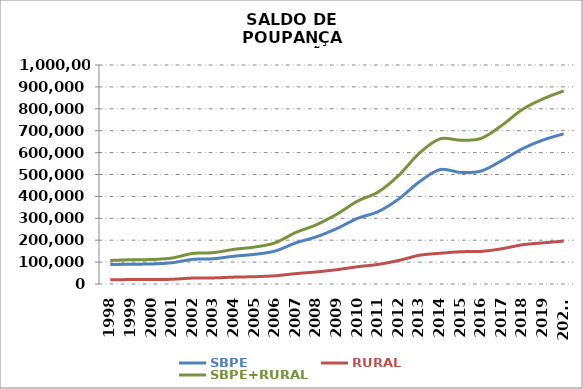
| Category | SBPE | RURAL | SBPE+RURAL |
|---|---|---|---|
| 1998 | 88538.349 | 18883.24 | 107421.589 |
| 1999 | 90437.74 | 20294.123 | 110731.863 |
| 2000 | 91430.45 | 20310.891 | 111741.341 |
| 2001 | 97146.25 | 21552.598 | 118698.848 |
| 2002 | 112423.444 | 27219.068 | 139642.512 |
| 2003 | 115258.021 | 27799.406 | 143057.427 |
| 2004 | 126853.217 | 31413.354 | 158266.571 |
| 2005 | 135411.681 | 33322.74 | 168734.421 |
| 2006 | 150412.546 | 37523.193 | 187935.739 |
| 2007 | 187827.264 | 47434.388 | 235261.652 |
| 2008 | 215400.282 | 54995.458 | 270395.74 |
| 2009 | 253604.98 | 65477.998 | 319082.978 |
| 2010 | 299878.217 | 78920.574 | 378798.791 |
| 2011 | 330569.272 | 89439.722 | 420008.994 |
| 2012 | 388641.662 | 107660.772 | 496302.434 |
| 2013 | 466788.644 | 131154.416 | 597943.06 |
| 2014 | 522343.501 | 140383.609 | 662727.11 |
| 2015 | 509223.044 | 147366.727 | 656589.771 |
| 2016 | 515955.43 | 149036.994 | 664992.424 |
| 2017 | 563741.675 | 160861.771 | 724603.446 |
| 2018 | 618146.063 | 179134.939 | 797281.002 |
| 2019 | 657531.442 | 187933.103 | 845464.545 |
| 2020* | 685675.702 | 195986.507 | 881662.209 |